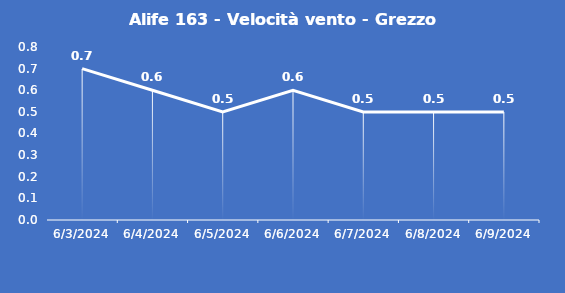
| Category | Alife 163 - Velocità vento - Grezzo (m/s) |
|---|---|
| 6/3/24 | 0.7 |
| 6/4/24 | 0.6 |
| 6/5/24 | 0.5 |
| 6/6/24 | 0.6 |
| 6/7/24 | 0.5 |
| 6/8/24 | 0.5 |
| 6/9/24 | 0.5 |